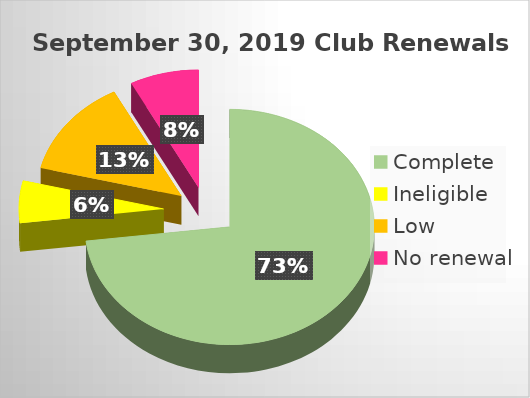
| Category | Series 0 |
|---|---|
| Complete | 0.731 |
| Ineligible | 0.058 |
| Low | 0.135 |
| No renewal | 0.077 |